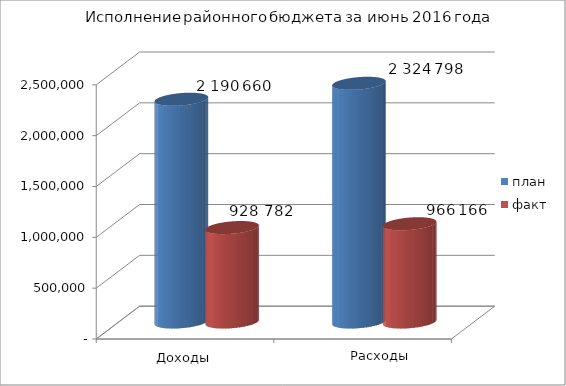
| Category | план | факт |
|---|---|---|
| 0 | 2190660 | 928782 |
| 1 | 2347798 | 966166 |